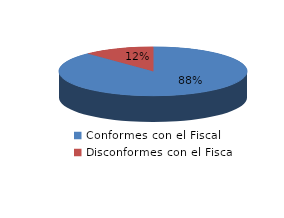
| Category | Series 0 |
|---|---|
| 0 | 160 |
| 1 | 22 |